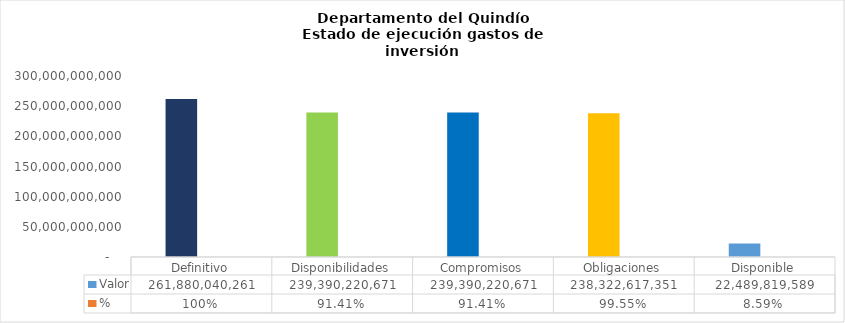
| Category | Valor | % |
|---|---|---|
| Definitivo | 261880040260.62 | 1 |
| Disponibilidades | 239390220671.213 | 0.914 |
| Compromisos | 239390220671.213 | 0.914 |
| Obligaciones | 238322617351.213 | 0.996 |
| Disponible | 22489819589.407 | 0.086 |